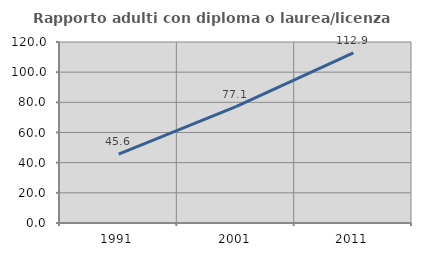
| Category | Rapporto adulti con diploma o laurea/licenza media  |
|---|---|
| 1991.0 | 45.643 |
| 2001.0 | 77.099 |
| 2011.0 | 112.863 |